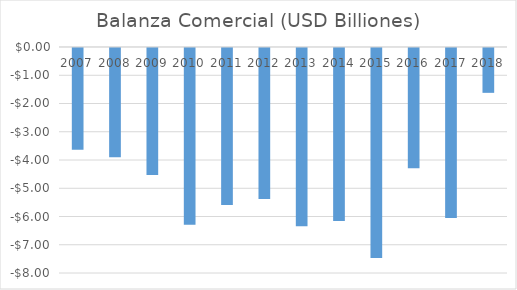
| Category | Series 0 |
|---|---|
| 2007.0 | -3.603 |
| 2008.0 | -3.87 |
| 2009.0 | -4.493 |
| 2010.0 | -6.261 |
| 2011.0 | -5.555 |
| 2012.0 | -5.346 |
| 2013.0 | -6.309 |
| 2014.0 | -6.126 |
| 2015.0 | -7.435 |
| 2016.0 | -4.261 |
| 2017.0 | -6.02 |
| 2018.0 | -1.587 |